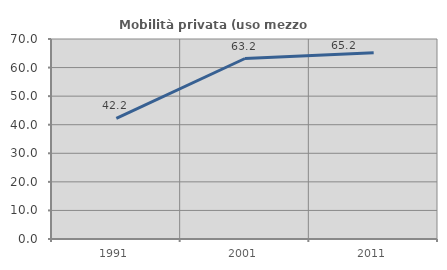
| Category | Mobilità privata (uso mezzo privato) |
|---|---|
| 1991.0 | 42.188 |
| 2001.0 | 63.174 |
| 2011.0 | 65.18 |